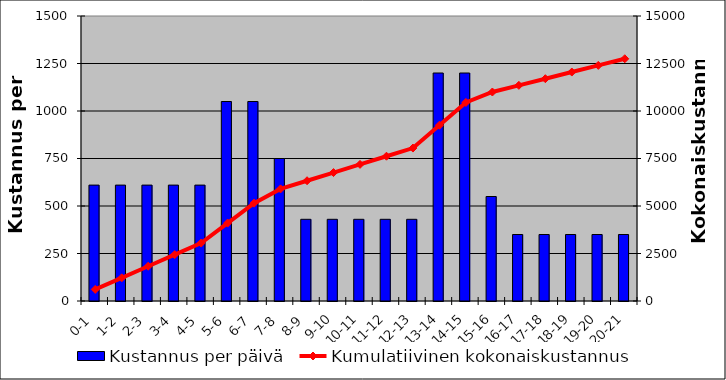
| Category | Kustannus per päivä |
|---|---|
| 0-1 | 610 |
| 1-2 | 610 |
| 2-3 | 610 |
| 3-4 | 610 |
| 4-5 | 610 |
| 5-6 | 1050 |
| 6-7 | 1050 |
| 7-8 | 750 |
| 8-9 | 430 |
| 9-10 | 430 |
| 10-11 | 430 |
| 11-12 | 430 |
| 12-13 | 430 |
| 13-14 | 1200 |
| 14-15 | 1200 |
| 15-16 | 550 |
| 16-17 | 350 |
| 17-18 | 350 |
| 18-19 | 350 |
| 19-20 | 350 |
| 20-21 | 350 |